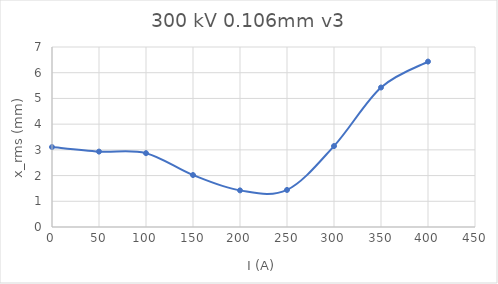
| Category | Series 0 |
|---|---|
| 0.0 | 3.11 |
| 50.0 | 2.932 |
| 100.0 | 2.871 |
| 150.0 | 2.021 |
| 200.0 | 1.424 |
| 250.0 | 1.441 |
| 300.0 | 3.147 |
| 350.0 | 5.425 |
| 400.0 | 6.432 |